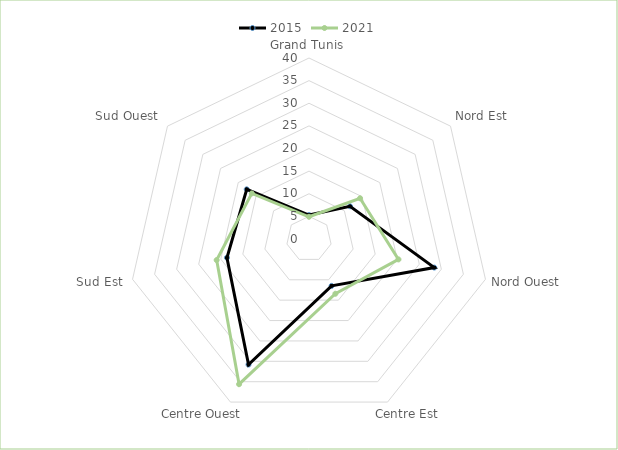
| Category | 2015 | 2021 |
|---|---|---|
| Grand Tunis | 5.3 | 4.911 |
| Nord Est | 11.6 | 14.429 |
| Nord Ouest | 28.4 | 20.28 |
| Centre Est | 11.5 | 13.427 |
| Centre Ouest | 30.8 | 35.613 |
| Sud Est | 18.6 | 20.929 |
| Sud Ouest | 17.6 | 16.17 |